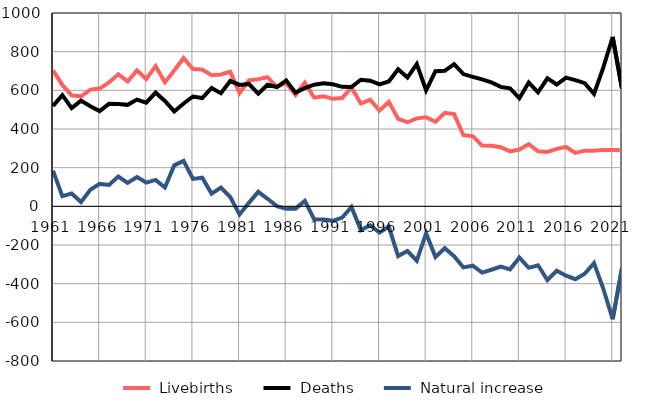
| Category |  Livebirths |  Deaths |  Natural increase |
|---|---|---|---|
| 1961.0 | 703 | 519 | 184 |
| 1962.0 | 628 | 575 | 53 |
| 1963.0 | 574 | 508 | 66 |
| 1964.0 | 569 | 547 | 22 |
| 1965.0 | 604 | 518 | 86 |
| 1966.0 | 609 | 493 | 116 |
| 1967.0 | 641 | 530 | 111 |
| 1968.0 | 683 | 529 | 154 |
| 1969.0 | 646 | 525 | 121 |
| 1970.0 | 703 | 552 | 151 |
| 1971.0 | 659 | 536 | 123 |
| 1972.0 | 725 | 588 | 137 |
| 1973.0 | 642 | 545 | 97 |
| 1974.0 | 703 | 491 | 212 |
| 1975.0 | 767 | 532 | 235 |
| 1976.0 | 710 | 568 | 142 |
| 1977.0 | 708 | 560 | 148 |
| 1978.0 | 678 | 612 | 66 |
| 1979.0 | 682 | 585 | 97 |
| 1980.0 | 696 | 648 | 48 |
| 1981.0 | 586 | 628 | -42 |
| 1982.0 | 651 | 633 | 18 |
| 1983.0 | 658 | 583 | 75 |
| 1984.0 | 668 | 629 | 39 |
| 1985.0 | 618 | 617 | 1 |
| 1986.0 | 638 | 651 | -13 |
| 1987.0 | 576 | 588 | -12 |
| 1988.0 | 640 | 612 | 28 |
| 1989.0 | 562 | 629 | -67 |
| 1990.0 | 569 | 637 | -68 |
| 1991.0 | 556 | 631 | -75 |
| 1992.0 | 560 | 618 | -58 |
| 1993.0 | 614 | 617 | -3 |
| 1994.0 | 532 | 655 | -123 |
| 1995.0 | 552 | 650 | -98 |
| 1996.0 | 495 | 631 | -136 |
| 1997.0 | 541 | 646 | -105 |
| 1998.0 | 452 | 709 | -257 |
| 1999.0 | 435 | 666 | -231 |
| 2000.0 | 455 | 736 | -281 |
| 2001.0 | 461 | 600 | -139 |
| 2002.0 | 437 | 699 | -262 |
| 2003.0 | 484 | 701 | -217 |
| 2004.0 | 477 | 735 | -258 |
| 2005.0 | 368 | 684 | -316 |
| 2006.0 | 363 | 670 | -307 |
| 2007.0 | 314 | 657 | -343 |
| 2008.0 | 313 | 641 | -328 |
| 2009.0 | 306 | 618 | -312 |
| 2010.0 | 284 | 610 | -326 |
| 2011.0 | 294 | 559 | -265 |
| 2012.0 | 322 | 640 | -318 |
| 2013.0 | 285 | 590 | -305 |
| 2014.0 | 281 | 662 | -381 |
| 2015.0 | 297 | 630 | -333 |
| 2016.0 | 307 | 666 | -359 |
| 2017.0 | 276 | 653 | -377 |
| 2018.0 | 288 | 637 | -349 |
| 2019.0 | 288 | 582 | -294 |
| 2020.0 | 292 | 719 | -427 |
| 2021.0 | 292 | 876 | -584 |
| 2022.0 | 290 | 609 | -319 |